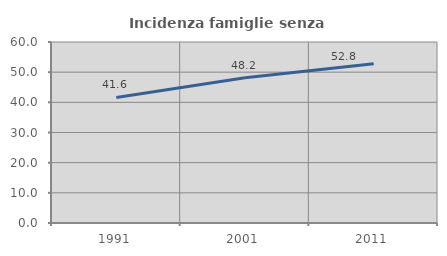
| Category | Incidenza famiglie senza nuclei |
|---|---|
| 1991.0 | 41.622 |
| 2001.0 | 48.168 |
| 2011.0 | 52.778 |